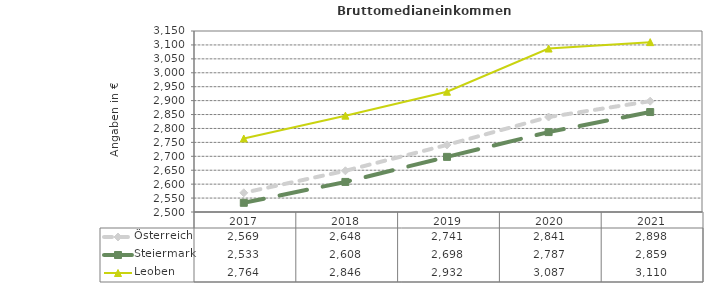
| Category | Österreich | Steiermark | Leoben |
|---|---|---|---|
| 2021.0 | 2898 | 2859 | 3110 |
| 2020.0 | 2841 | 2787 | 3087 |
| 2019.0 | 2741 | 2698 | 2932 |
| 2018.0 | 2648 | 2608 | 2846 |
| 2017.0 | 2569 | 2533 | 2764 |